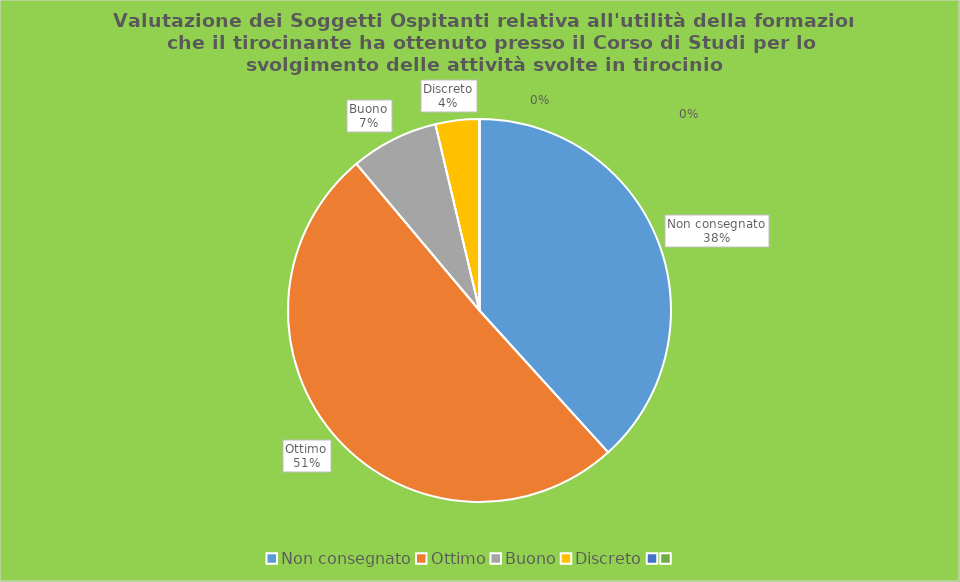
| Category | Series 0 |
|---|---|
| Non consegnato | 31 |
| Ottimo | 41 |
| Buono | 6 |
| Discreto | 3 |